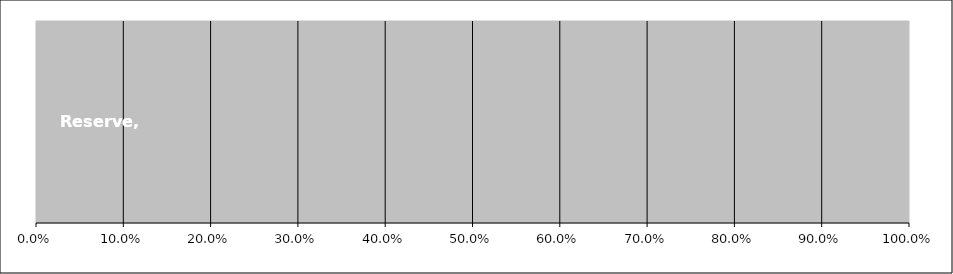
| Category | Reserve % |
|---|---|
| Reserve | 0 |